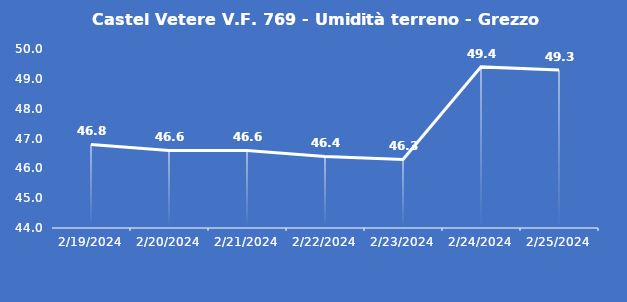
| Category | Castel Vetere V.F. 769 - Umidità terreno - Grezzo (%VWC) |
|---|---|
| 2/19/24 | 46.8 |
| 2/20/24 | 46.6 |
| 2/21/24 | 46.6 |
| 2/22/24 | 46.4 |
| 2/23/24 | 46.3 |
| 2/24/24 | 49.4 |
| 2/25/24 | 49.3 |